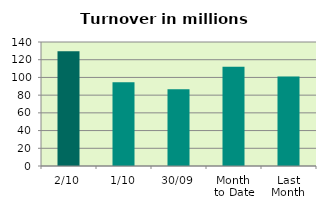
| Category | Series 0 |
|---|---|
| 2/10 | 129.473 |
| 1/10 | 94.458 |
| 30/09 | 86.744 |
| Month 
to Date | 111.965 |
| Last
Month | 100.935 |